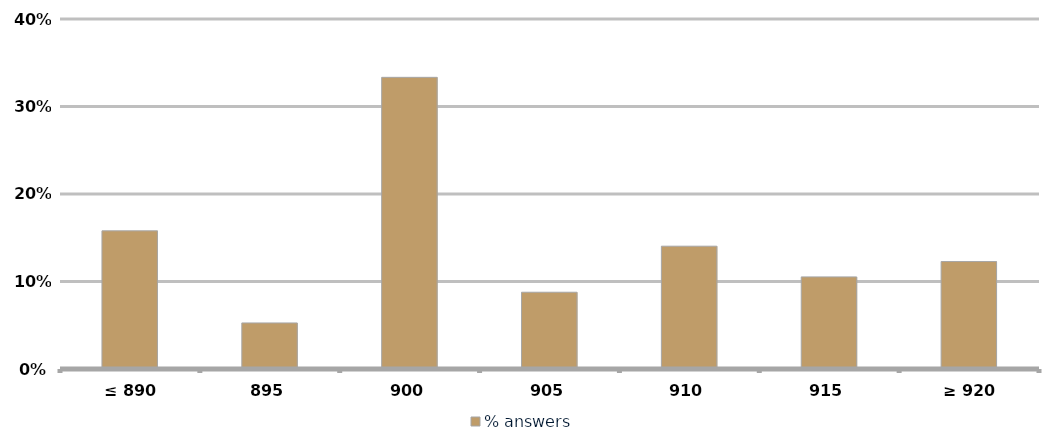
| Category | % answers |
|---|---|
| ≤ 890 | 0.158 |
| 895 | 0.053 |
| 900 | 0.333 |
| 905 | 0.088 |
| 910 | 0.14 |
| 915 | 0.105 |
| ≥ 920 | 0.123 |